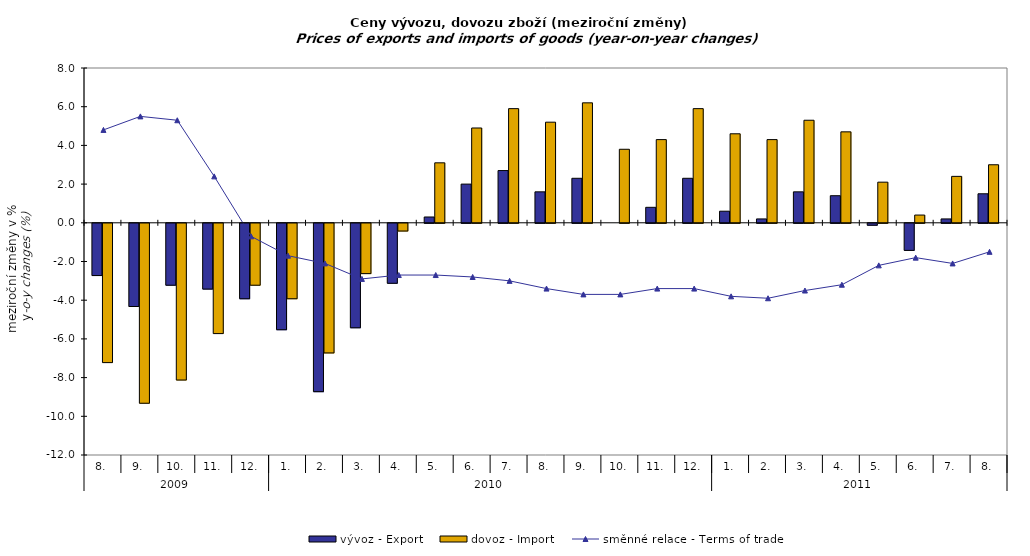
| Category | vývoz - Export | dovoz - Import |
|---|---|---|
| 0 | -2.7 | -7.2 |
| 1 | -4.3 | -9.3 |
| 2 | -3.2 | -8.1 |
| 3 | -3.4 | -5.7 |
| 4 | -3.9 | -3.2 |
| 5 | -5.5 | -3.9 |
| 6 | -8.7 | -6.7 |
| 7 | -5.4 | -2.6 |
| 8 | -3.1 | -0.4 |
| 9 | 0.3 | 3.1 |
| 10 | 2 | 4.9 |
| 11 | 2.7 | 5.9 |
| 12 | 1.6 | 5.2 |
| 13 | 2.3 | 6.2 |
| 14 | 0 | 3.8 |
| 15 | 0.8 | 4.3 |
| 16 | 2.3 | 5.9 |
| 17 | 0.6 | 4.6 |
| 18 | 0.2 | 4.3 |
| 19 | 1.6 | 5.3 |
| 20 | 1.4 | 4.7 |
| 21 | -0.1 | 2.1 |
| 22 | -1.4 | 0.4 |
| 23 | 0.2 | 2.4 |
| 24 | 1.5 | 3 |